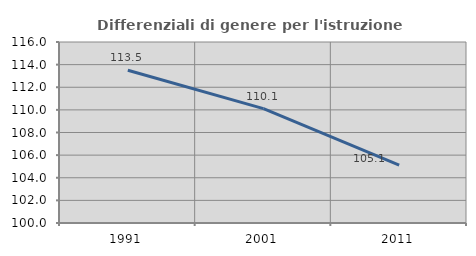
| Category | Differenziali di genere per l'istruzione superiore |
|---|---|
| 1991.0 | 113.5 |
| 2001.0 | 110.111 |
| 2011.0 | 105.125 |